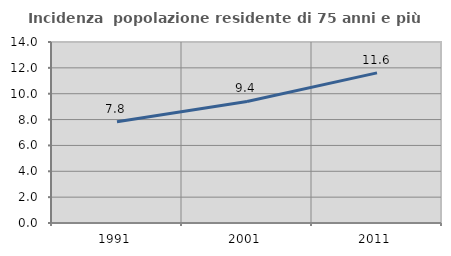
| Category | Incidenza  popolazione residente di 75 anni e più |
|---|---|
| 1991.0 | 7.837 |
| 2001.0 | 9.405 |
| 2011.0 | 11.613 |